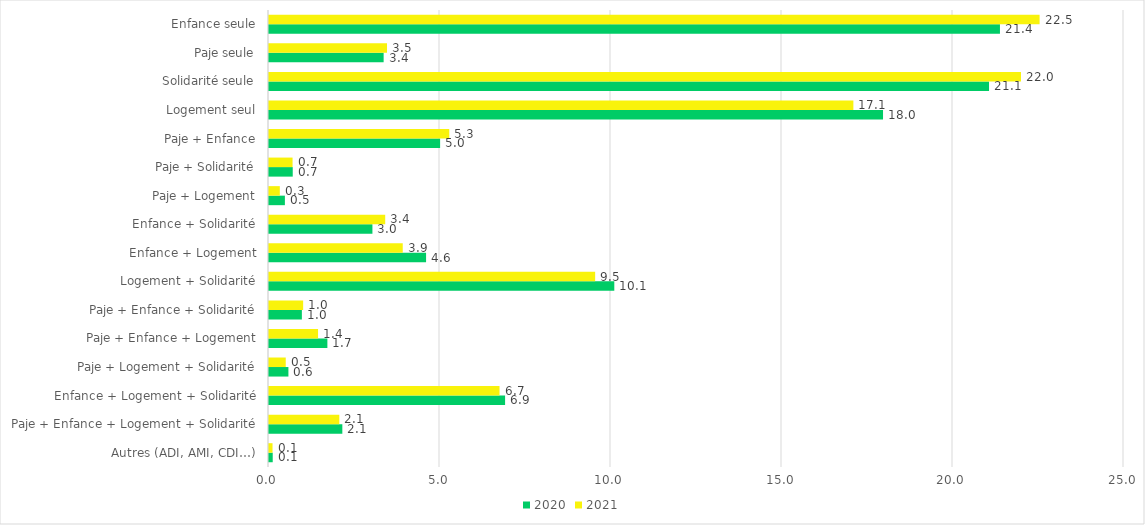
| Category | 2020 | 2021 |
|---|---|---|
| Autres (ADI, AMI, CDI…) | 0.109 | 0.103 |
| Paje + Enfance + Logement + Solidarité | 2.144 | 2.056 |
| Enfance + Logement + Solidarité | 6.903 | 6.74 |
| Paje + Logement + Solidarité | 0.568 | 0.489 |
| Paje + Enfance + Logement | 1.707 | 1.434 |
| Paje + Enfance + Solidarité | 0.961 | 0.998 |
| Logement + Solidarité | 10.097 | 9.537 |
| Enfance + Logement | 4.593 | 3.911 |
| Enfance + Solidarité | 3.024 | 3.398 |
| Paje + Logement | 0.465 | 0.316 |
| Paje + Solidarité | 0.694 | 0.689 |
| Paje + Enfance | 5.003 | 5.271 |
| Logement seul | 17.954 | 17.087 |
| Solidarité seule | 21.054 | 21.988 |
| Paje seule | 3.352 | 3.45 |
| Enfance seule | 21.373 | 22.532 |